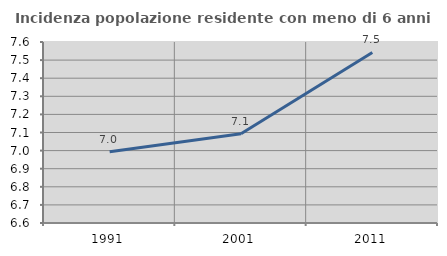
| Category | Incidenza popolazione residente con meno di 6 anni |
|---|---|
| 1991.0 | 6.994 |
| 2001.0 | 7.093 |
| 2011.0 | 7.542 |